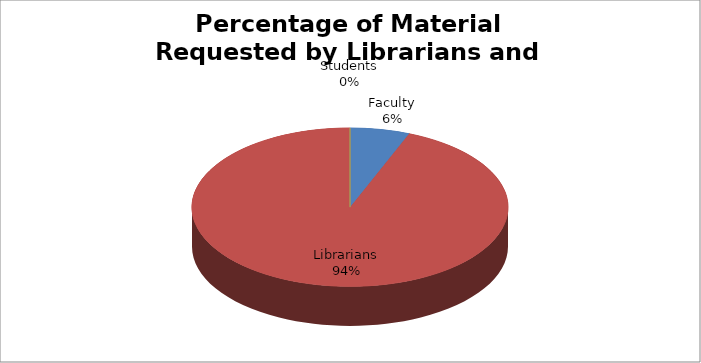
| Category | Series 0 |
|---|---|
| Faculty | 10 |
| Librarians | 154 |
| Students | 0 |